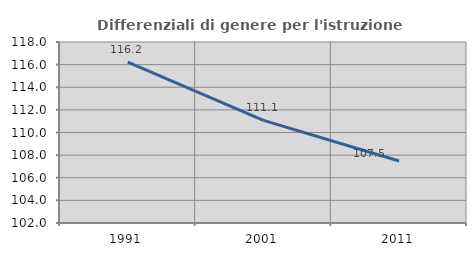
| Category | Differenziali di genere per l'istruzione superiore |
|---|---|
| 1991.0 | 116.227 |
| 2001.0 | 111.075 |
| 2011.0 | 107.482 |